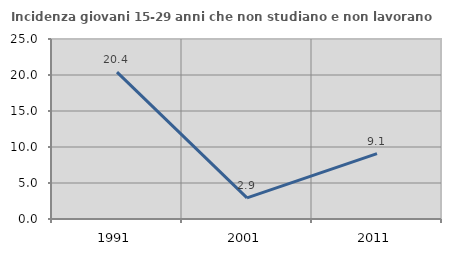
| Category | Incidenza giovani 15-29 anni che non studiano e non lavorano  |
|---|---|
| 1991.0 | 20.404 |
| 2001.0 | 2.941 |
| 2011.0 | 9.091 |